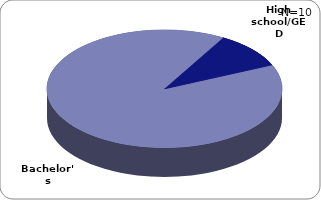
| Category | Series 0 |
|---|---|
| High school/GED | 0.1 |
| Bachelor's | 0.9 |